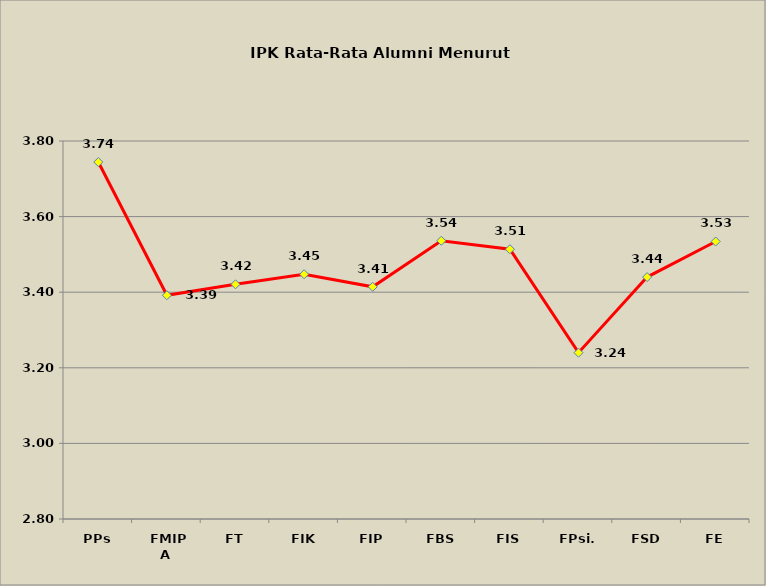
| Category | Series 0 |
|---|---|
|  PPs | 3.744 |
|  FMIPA | 3.392 |
|  FT | 3.421 |
|  FIK | 3.448 |
|  FIP | 3.414 |
|  FBS | 3.536 |
|  FIS | 3.514 |
|  FPsi. | 3.24 |
|  FSD | 3.44 |
|  FE | 3.534 |